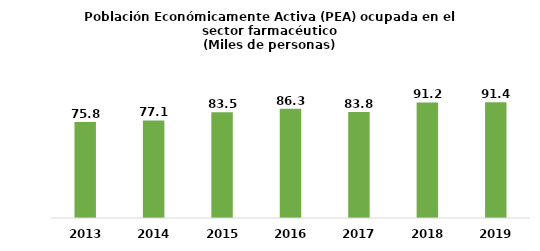
| Category | Series 0 |
|---|---|
| 2013.0 | 75.832 |
| 2014.0 | 77.072 |
| 2015.0 | 83.472 |
| 2016.0 | 86.337 |
| 2017.0 | 83.767 |
| 2018.0 | 91.202 |
| 2019.0 | 91.414 |